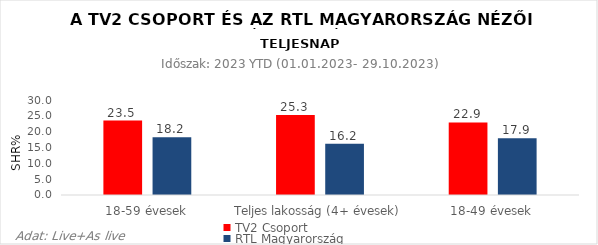
| Category | TV2 Csoport | RTL Magyarország |
|---|---|---|
| 18-59 évesek | 23.5 | 18.2 |
| Teljes lakosság (4+ évesek) | 25.3 | 16.2 |
| 18-49 évesek | 22.9 | 17.9 |